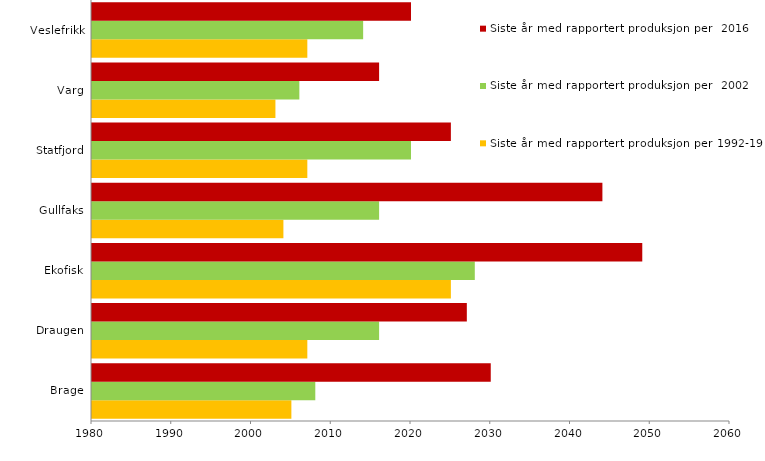
| Category | Siste år med rapportert produksjon per 1992-1995 | Siste år med rapportert produksjon per  2002 | Siste år med rapportert produksjon per  2016 |
|---|---|---|---|
| Brage | 2005 | 2008 | 2030 |
| Draugen | 2007 | 2016 | 2027 |
| Ekofisk | 2025 | 2028 | 2049 |
| Gullfaks | 2004 | 2016 | 2044 |
| Statfjord | 2007 | 2020 | 2025 |
| Varg | 2003 | 2006 | 2016 |
| Veslefrikk | 2007 | 2014 | 2020 |